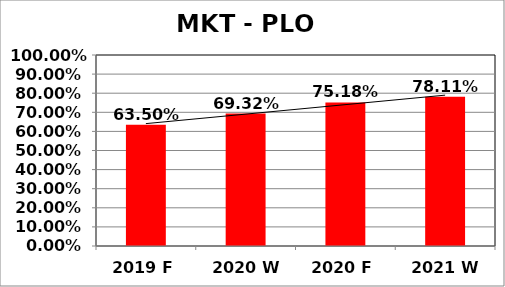
| Category | Series 0 |
|---|---|
| 2019 F | 0.635 |
| 2020 W | 0.693 |
| 2020 F | 0.752 |
| 2021 W | 0.781 |